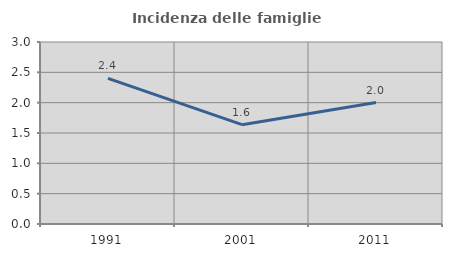
| Category | Incidenza delle famiglie numerose |
|---|---|
| 1991.0 | 2.401 |
| 2001.0 | 1.637 |
| 2011.0 | 2.002 |